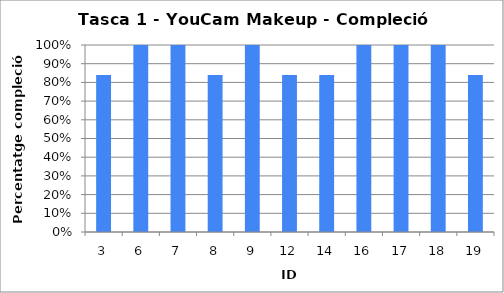
| Category | Percentatge de compleció (%) |
|---|---|
| 3.0 | 0.84 |
| 6.0 | 1 |
| 7.0 | 1 |
| 8.0 | 0.84 |
| 9.0 | 1 |
| 12.0 | 0.84 |
| 14.0 | 0.84 |
| 16.0 | 1 |
| 17.0 | 1 |
| 18.0 | 1 |
| 19.0 | 0.84 |